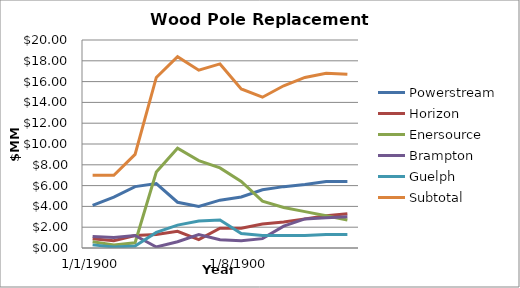
| Category | Powerstream  | Horizon  | Enersource  | Brampton  | Guelph  | Subtotal  |
|---|---|---|---|---|---|---|
| 0 | 4.1 | 0.9 | 0.6 | 1.1 | 0.3 | 7 |
| 1 | 4.9 | 0.7 | 0.3 | 1 | 0.1 | 7 |
| 2 | 5.9 | 1.2 | 0.5 | 1.2 | 0.2 | 9 |
| 3 | 6.2 | 1.3 | 7.3 | 0.1 | 1.5 | 16.4 |
| 4 | 4.4 | 1.6 | 9.6 | 0.6 | 2.2 | 18.4 |
| 5 | 4 | 0.8 | 8.4 | 1.3 | 2.6 | 17.1 |
| 6 | 4.6 | 1.9 | 7.7 | 0.8 | 2.7 | 17.7 |
| 7 | 4.9 | 1.9 | 6.4 | 0.7 | 1.4 | 15.3 |
| 8 | 5.6 | 2.3 | 4.5 | 0.9 | 1.2 | 14.5 |
| 9 | 5.9 | 2.5 | 3.9 | 2.1 | 1.2 | 15.6 |
| 10 | 6.1 | 2.8 | 3.5 | 2.8 | 1.2 | 16.4 |
| 11 | 6.4 | 3.1 | 3.1 | 2.9 | 1.3 | 16.8 |
| 12 | 6.4 | 3.3 | 2.7 | 3 | 1.3 | 16.7 |